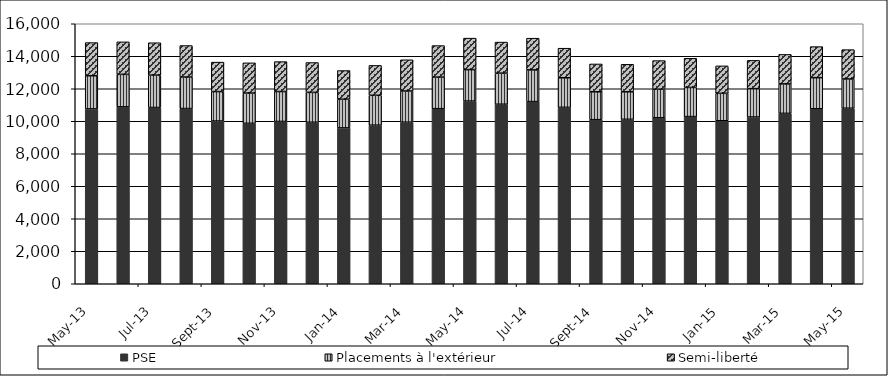
| Category | PSE | Placements à l'extérieur | Semi-liberté |
|---|---|---|---|
| 2013-05-01 | 10760 | 2041 | 2041 |
| 2013-06-01 | 10886 | 2000 | 2000 |
| 2013-07-01 | 10846 | 1993 | 1993 |
| 2013-08-01 | 10782 | 1939 | 1939 |
| 2013-09-01 | 10013 | 1813 | 1813 |
| 2013-10-01 | 9874 | 1860 | 1860 |
| 2013-11-01 | 9987 | 1842 | 1842 |
| 2013-12-01 | 9938 | 1838 | 1838 |
| 2014-01-01 | 9591 | 1765 | 1765 |
| 2014-02-01 | 9760 | 1838 | 1838 |
| 2014-03-01 | 9943 | 1920 | 1920 |
| 2014-04-01 | 10773 | 1942 | 1942 |
| 2014-05-01 | 11241 | 1937 | 1937 |
| 2014-06-01 | 11048 | 1912 | 1912 |
| 2014-07-01 | 11210 | 1951 | 1951 |
| 2014-08-01 | 10856 | 1820 | 1820 |
| 2014-09-01 | 10098 | 1714 | 1714 |
| 2014-10-01 | 10120 | 1692 | 1692 |
| 2014-11-01 | 10213 | 1760 | 1760 |
| 2014-12-01 | 10287 | 1794 | 1794 |
| 2015-01-01 | 10030 | 1689 | 1689 |
| 2015-02-01 | 10261 | 1743 | 1743 |
| 2015-03-01 | 10485 | 1814 | 1814 |
| 2015-04-01 | 10770 | 1912 | 1912 |
| 2015-05-01 | 10801 | 1803 | 1803 |